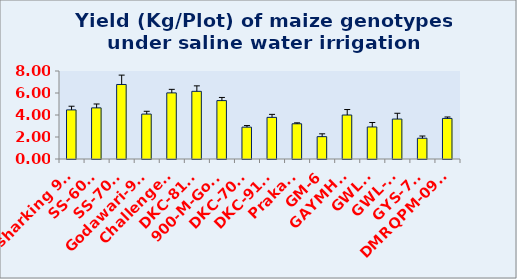
| Category | Yield (Kg/Plot) |
|---|---|
| Kesharking 919 | 4.463 |
| SS-6066 | 4.648 |
| SS-7077 | 6.775 |
| Godawari-989 | 4.083 |
| Challenge-1 | 6.011 |
| DKC-8101 | 6.151 |
| 900-M-Gold | 5.309 |
| DKC-7074 | 2.895 |
| DKC-9117 | 3.785 |
| Prakash | 3.203 |
| GM-6 | 2.032 |
| GAYMH-1 | 3.998 |
| GWL-8 | 2.912 |
| GWL-15 | 3.631 |
| GYS-705 | 1.887 |
| DMRQPM-0903 | 3.689 |